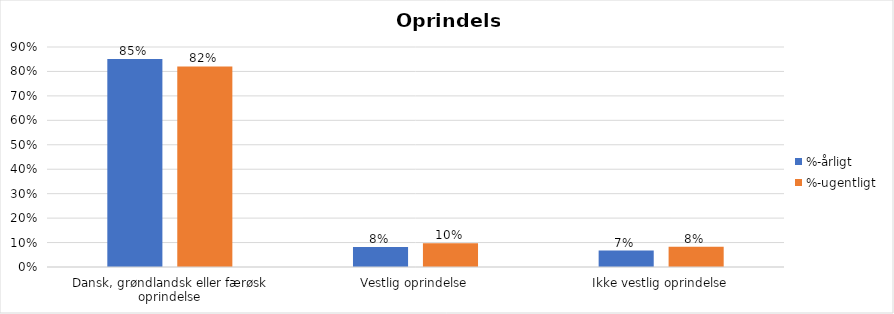
| Category | %-årligt | %-ugentligt |
|---|---|---|
| Dansk, grøndlandsk eller færøsk oprindelse | 0.851 | 0.82 |
| Vestlig oprindelse | 0.082 | 0.097 |
| Ikke vestlig oprindelse | 0.067 | 0.083 |